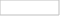
| Category | The teaching schedule is reasonable and fair |
|---|---|
| 0 | 5 |
| 1 | 12 |
| 2 | 15 |
| 3 | 4 |
| 4 | 0 |